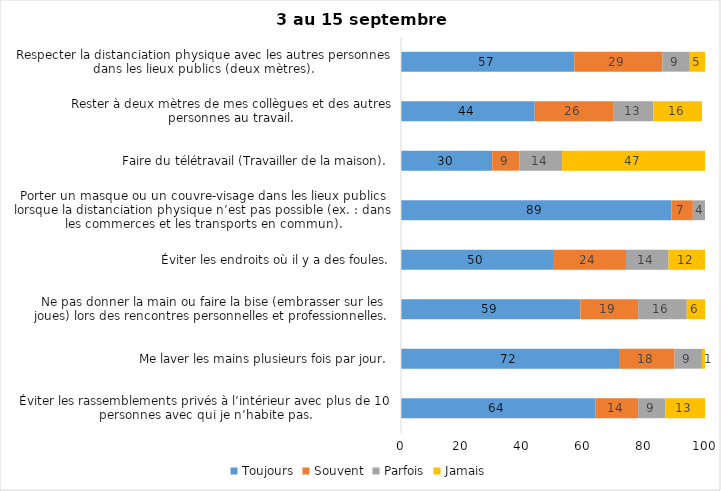
| Category | Toujours | Souvent | Parfois | Jamais |
|---|---|---|---|---|
| Éviter les rassemblements privés à l’intérieur avec plus de 10 personnes avec qui je n’habite pas. | 64 | 14 | 9 | 13 |
| Me laver les mains plusieurs fois par jour. | 72 | 18 | 9 | 1 |
| Ne pas donner la main ou faire la bise (embrasser sur les joues) lors des rencontres personnelles et professionnelles. | 59 | 19 | 16 | 6 |
| Éviter les endroits où il y a des foules. | 50 | 24 | 14 | 12 |
| Porter un masque ou un couvre-visage dans les lieux publics lorsque la distanciation physique n’est pas possible (ex. : dans les commerces et les transports en commun). | 89 | 7 | 4 | 0 |
| Faire du télétravail (Travailler de la maison). | 30 | 9 | 14 | 47 |
| Rester à deux mètres de mes collègues et des autres personnes au travail. | 44 | 26 | 13 | 16 |
| Respecter la distanciation physique avec les autres personnes dans les lieux publics (deux mètres). | 57 | 29 | 9 | 5 |